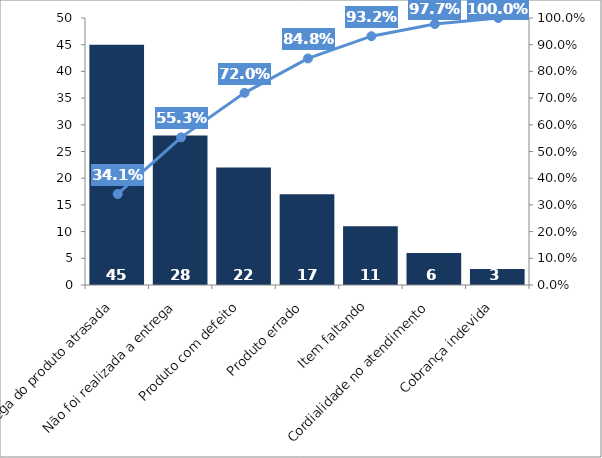
| Category | Ex: Reclamações dos clientes |
|---|---|
| Entrega do produto atrasada | 45 |
| Não foi realizada a entrega | 28 |
| Produto com defeito | 22 |
| Produto errado | 17 |
| Item faltando | 11 |
| Cordialidade no atendimento | 6 |
| Cobrança indevida | 3 |